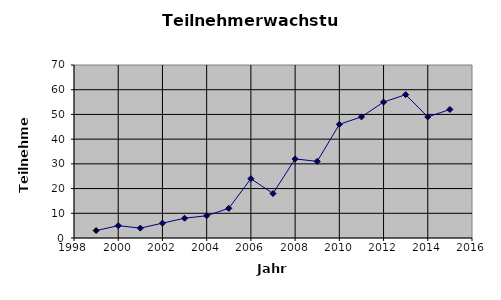
| Category | Series 0 |
|---|---|
| 1999.0 | 3 |
| 2000.0 | 5 |
| 2001.0 | 4 |
| 2002.0 | 6 |
| 2003.0 | 8 |
| 2004.0 | 9 |
| 2005.0 | 12 |
| 2006.0 | 24 |
| 2007.0 | 18 |
| 2008.0 | 32 |
| 2009.0 | 31 |
| 2010.0 | 46 |
| 2011.0 | 49 |
| 2012.0 | 55 |
| 2013.0 | 58 |
| 2014.0 | 49 |
| 2015.0 | 52 |